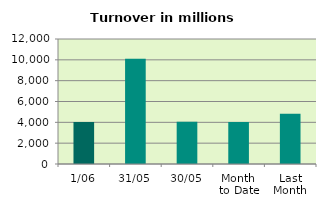
| Category | Series 0 |
|---|---|
| 1/06 | 4037.212 |
| 31/05 | 10109.417 |
| 30/05 | 4056.505 |
| Month 
to Date | 4037.212 |
| Last
Month | 4818.103 |